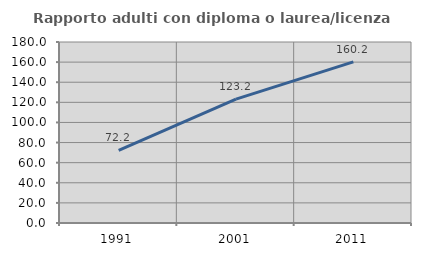
| Category | Rapporto adulti con diploma o laurea/licenza media  |
|---|---|
| 1991.0 | 72.152 |
| 2001.0 | 123.158 |
| 2011.0 | 160.204 |